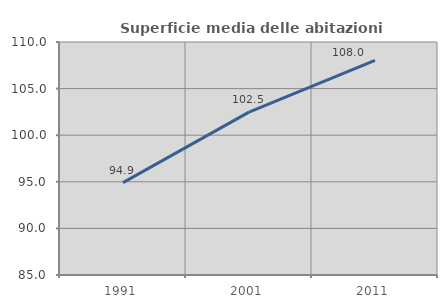
| Category | Superficie media delle abitazioni occupate |
|---|---|
| 1991.0 | 94.907 |
| 2001.0 | 102.471 |
| 2011.0 | 108.034 |